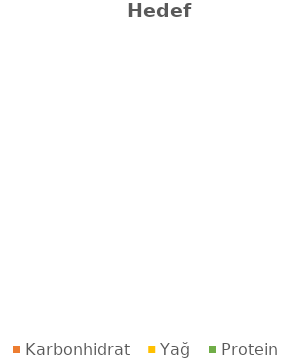
| Category | Series 0 |
|---|---|
| Karbonhidrat | 0 |
| Yağ | 0 |
| Protein | 0 |